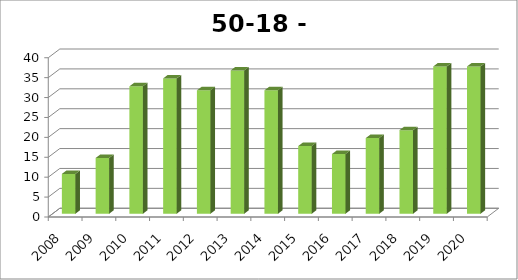
| Category | Berkel-Enschot |
|---|---|
| 2008.0 | 10 |
| 2009.0 | 14 |
| 2010.0 | 32 |
| 2011.0 | 34 |
| 2012.0 | 31 |
| 2013.0 | 36 |
| 2014.0 | 31 |
| 2015.0 | 17 |
| 2016.0 | 15 |
| 2017.0 | 19 |
| 2018.0 | 21 |
| 2019.0 | 37 |
| 2020.0 | 37 |